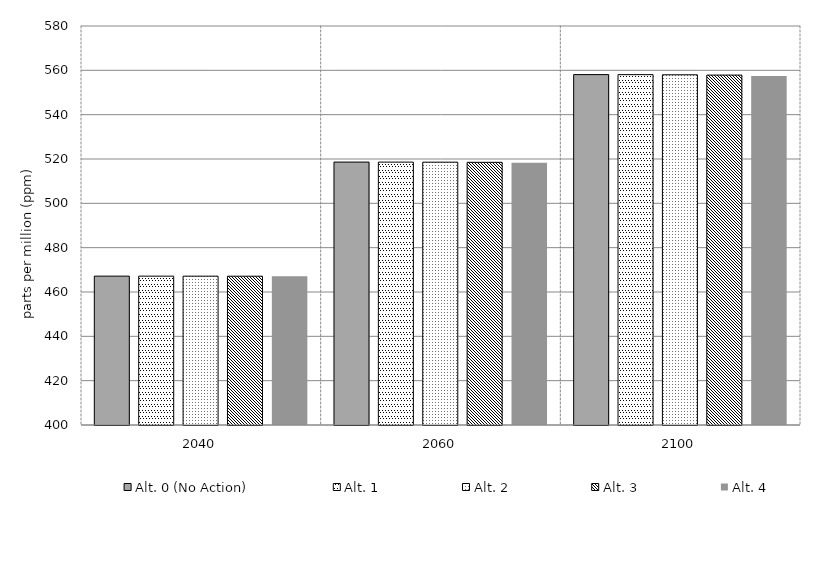
| Category | Alt. 0 (No Action) | Alt. 1 | Alt. 2 | Alt. 3 | Alt. 4 | Alt 5 | Alt 6 | Alt 7 | Alt 8 | Alt 10 |
|---|---|---|---|---|---|---|---|---|---|---|
| 2040.0 | 467.159 | 467.148 | 467.142 | 467.125 | 467.069 |  |  |  |  |  |
| 2060.0 | 518.609 | 518.592 | 518.565 | 518.503 | 518.293 |  |  |  |  |  |
| 2100.0 | 558.072 | 558.052 | 557.991 | 557.857 | 557.412 |  |  |  |  |  |